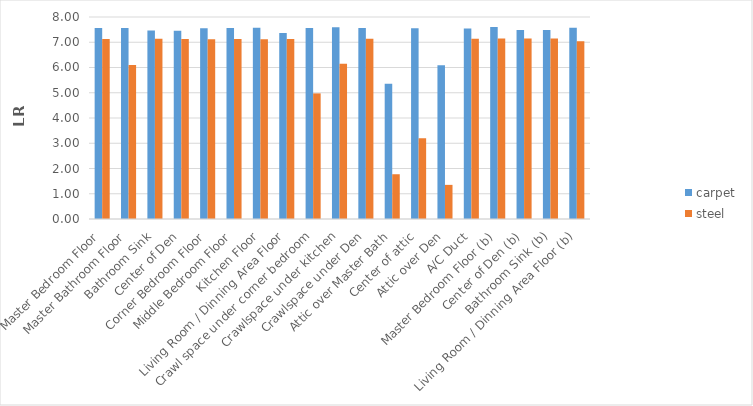
| Category | carpet | steel |
|---|---|---|
| Master Bedroom Floor | 7.562 | 7.132 |
| Master Bathroom Floor | 7.564 | 6.104 |
| Bathroom Sink | 7.466 | 7.142 |
| Center of Den | 7.46 | 7.132 |
| Corner Bedroom Floor | 7.555 | 7.123 |
| Middle Bedroom Floor | 7.562 | 7.128 |
| Kitchen Floor | 7.571 | 7.121 |
| Living Room / Dinning Area Floor | 7.368 | 7.132 |
| Crawl space under corner bedroom | 7.562 | 4.975 |
| Crawlspace under kitchen | 7.595 | 6.146 |
| Crawlspace under Den | 7.56 | 7.138 |
| Attic over Master Bath | 5.359 | 1.773 |
| Center of attic | 7.555 | 3.198 |
| Attic over Den | 6.089 | 1.352 |
| A/C Duct | 7.546 | 7.134 |
| Master Bedroom Floor (b) | 7.604 | 7.146 |
| Center of Den (b) | 7.481 | 7.146 |
| Bathroom Sink (b) | 7.481 | 7.152 |
| Living Room / Dinning Area Floor (b) | 7.575 | 7.042 |